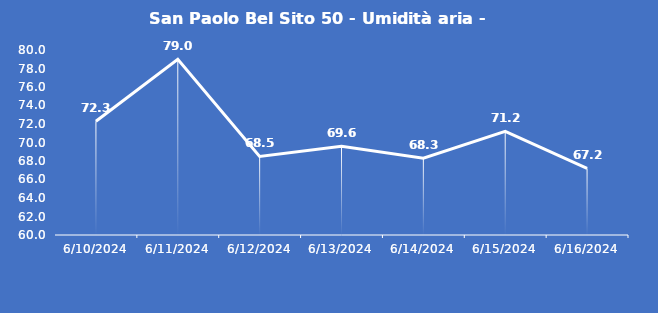
| Category | San Paolo Bel Sito 50 - Umidità aria - Grezzo (%) |
|---|---|
| 6/10/24 | 72.3 |
| 6/11/24 | 79 |
| 6/12/24 | 68.5 |
| 6/13/24 | 69.6 |
| 6/14/24 | 68.3 |
| 6/15/24 | 71.2 |
| 6/16/24 | 67.2 |